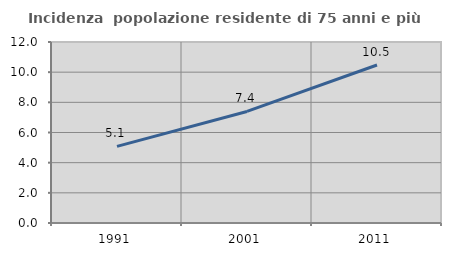
| Category | Incidenza  popolazione residente di 75 anni e più |
|---|---|
| 1991.0 | 5.082 |
| 2001.0 | 7.396 |
| 2011.0 | 10.477 |